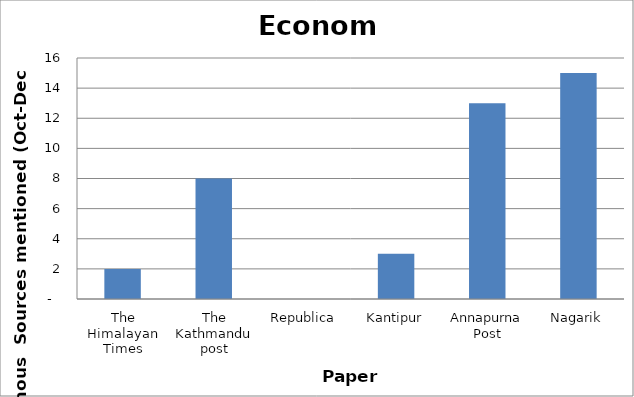
| Category | Economy |
|---|---|
| The Himalayan Times | 2 |
| The Kathmandu post | 8 |
| Republica | 0 |
| Kantipur | 3 |
| Annapurna Post | 13 |
| Nagarik | 15 |